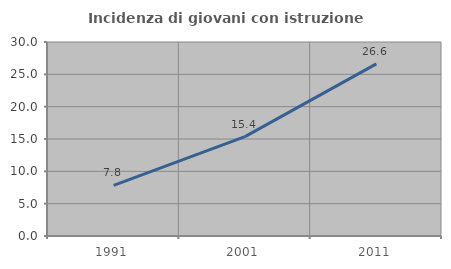
| Category | Incidenza di giovani con istruzione universitaria |
|---|---|
| 1991.0 | 7.834 |
| 2001.0 | 15.369 |
| 2011.0 | 26.619 |